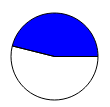
| Category | Series 0 |
|---|---|
| 0 | 96.949 |
| 1 | 82.919 |